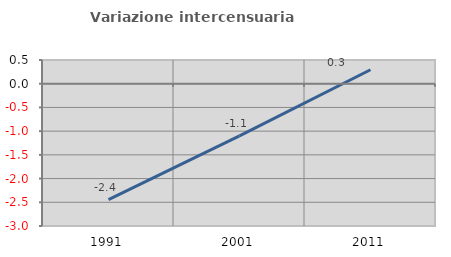
| Category | Variazione intercensuaria annua |
|---|---|
| 1991.0 | -2.443 |
| 2001.0 | -1.101 |
| 2011.0 | 0.294 |